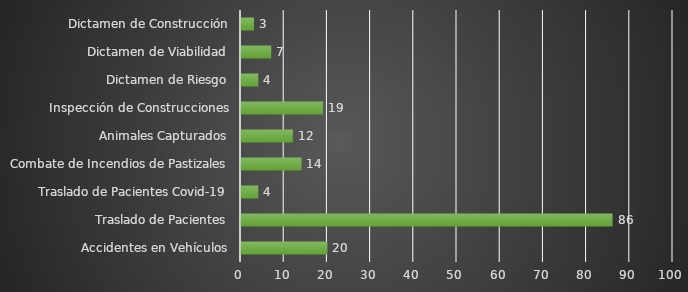
| Category | INDICADOR  |
|---|---|
| Accidentes en Vehículos | 20 |
| Traslado de Pacientes | 86 |
| Traslado de Pacientes Covid-19 | 4 |
| Combate de Incendios de Pastizales | 14 |
| Animales Capturados | 12 |
| Inspección de Construcciones | 19 |
| Dictamen de Riesgo | 4 |
| Dictamen de Viabilidad | 7 |
| Dictamen de Construcción | 3 |